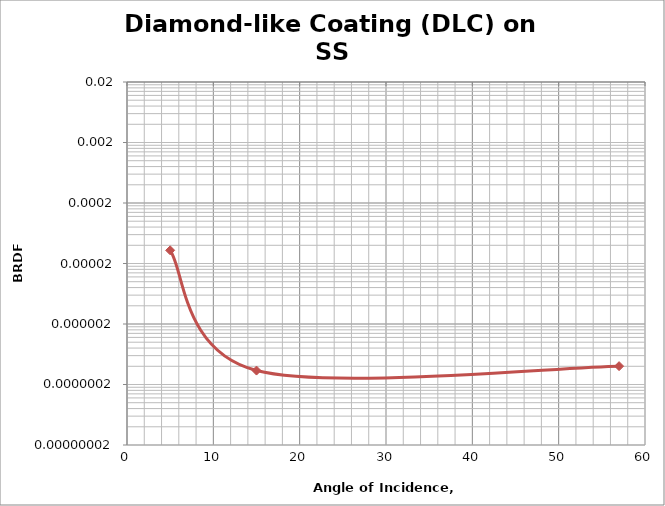
| Category | Series 1 |
|---|---|
| 5.0 | 0 |
| 15.0 | 0 |
| 57.0 | 0 |